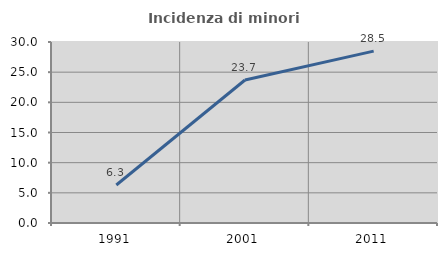
| Category | Incidenza di minori stranieri |
|---|---|
| 1991.0 | 6.303 |
| 2001.0 | 23.701 |
| 2011.0 | 28.482 |